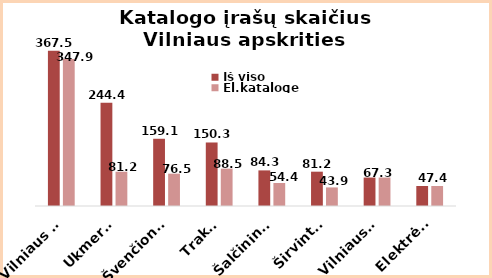
| Category | Iš viso | El.kataloge |
|---|---|---|
| Vilniaus m. | 367.462 | 347.882 |
| Ukmergė | 244.382 | 81.176 |
| Švenčionys | 159.137 | 76.527 |
| Trakai | 150.331 | 88.459 |
| Šalčininkai | 84.283 | 54.416 |
| Širvintos | 81.21 | 43.948 |
| Vilniaus r. | 67.341 | 67.341 |
| Elektrėnai | 47.371 | 47.371 |